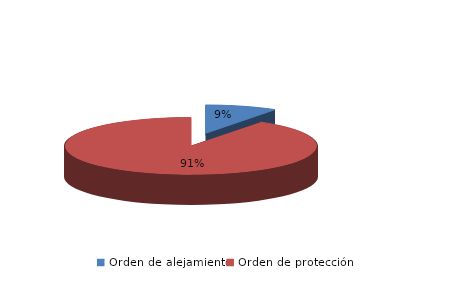
| Category | Series 0 |
|---|---|
| Orden de alejamiento | 35 |
| Orden de protección | 345 |